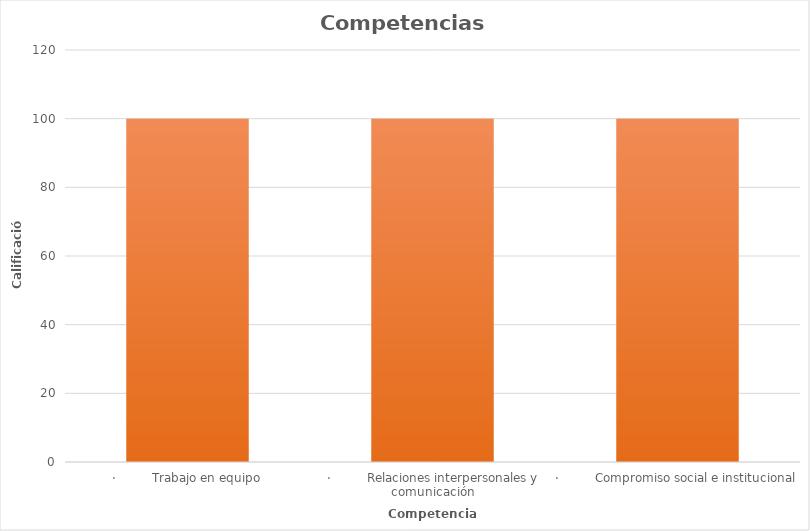
| Category | Series 0 |
|---|---|
| ·         Trabajo en equipo | 100 |
| ·         Relaciones interpersonales y comunicación | 100 |
| ·         Compromiso social e institucional | 100 |